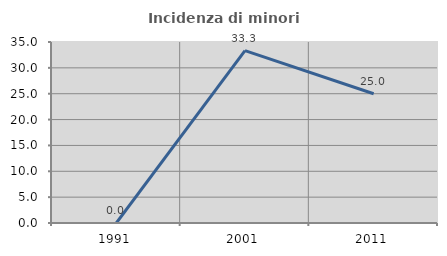
| Category | Incidenza di minori stranieri |
|---|---|
| 1991.0 | 0 |
| 2001.0 | 33.333 |
| 2011.0 | 25 |